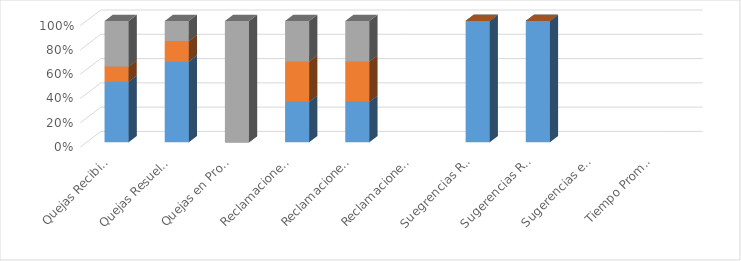
| Category | ENERO | FEBRERO | MARZO |
|---|---|---|---|
| Quejas Recibidas | 4 | 1 | 3 |
| Quejas Resueltas | 4 | 1 | 1 |
| Quejas en Proceso | 0 | 0 | 2 |
| Reclamaciones Recibidas | 1 | 1 | 1 |
| Reclamaciones Resueltas | 1 | 1 | 1 |
| Reclamaciones en Proceso | 0 | 0 | 0 |
| Suegrencias Recibidas | 1 | 0 | 0 |
| Sugerencias Resueltas | 1 | 0 | 0 |
| Sugerencias en Proceso | 0 | 0 | 0 |
| Tiempo Promedio en que fueron Respondidas | 0 | 0 | 0 |